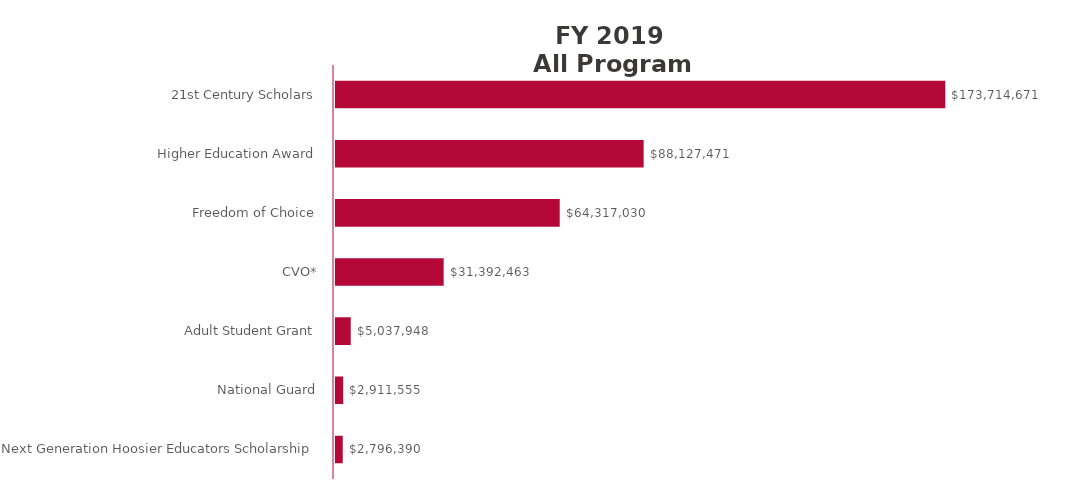
| Category | Series 0 |
|---|---|
| Next Generation Hoosier Educators Scholarship | 2796390 |
| National Guard | 2911555 |
| Adult Student Grant | 5037948 |
| CVO* | 31392463 |
| Freedom of Choice | 64317030 |
| Higher Education Award | 88127471 |
| 21st Century Scholars | 173714671 |